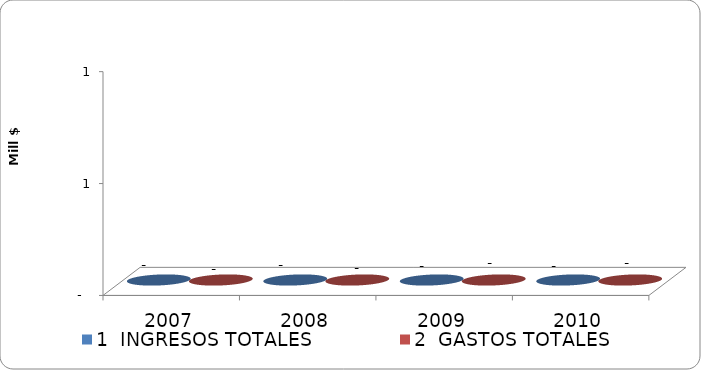
| Category | 1  INGRESOS TOTALES | 2  GASTOS TOTALES |
|---|---|---|
| 2007 | 0 | 0 |
| 2008 | 0 | 0 |
| 2009 | 0 | 0 |
| 2010 | 0 | 0 |